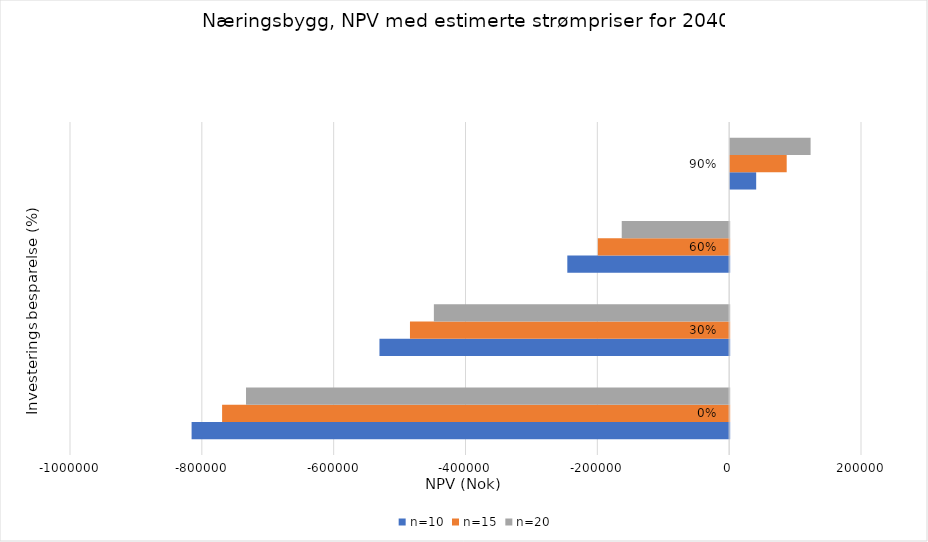
| Category | n=10 | n=15 | n=20 |
|---|---|---|---|
| 0.0 | -815533.376 | -769248.189 | -732982.533 |
| 0.3 | -530533.376 | -484248.189 | -447982.533 |
| 0.6 | -245533.376 | -199248.189 | -162982.533 |
| 0.9 | 39466.624 | 85751.811 | 122017.467 |